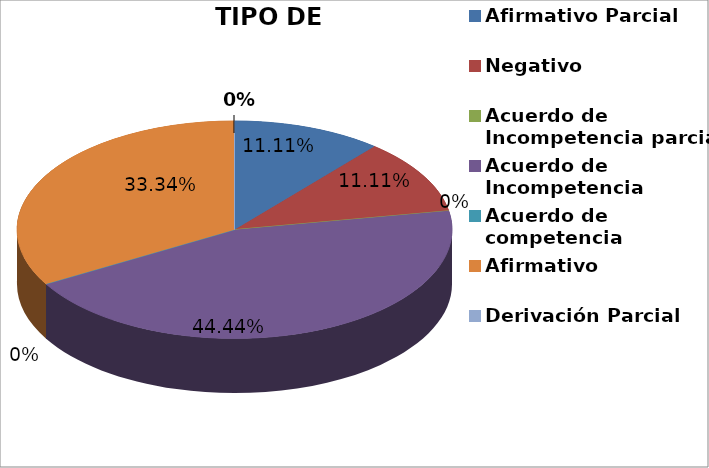
| Category | Series 0 |
|---|---|
| Afirmativo Parcial | 1 |
| Negativo | 1 |
| Acuerdo de Incompetencia parcial | 0 |
| Acuerdo de Incompetencia | 4 |
| Acuerdo de competencia | 0 |
| Afirmativo | 3 |
| Derivación Parcial | 0 |